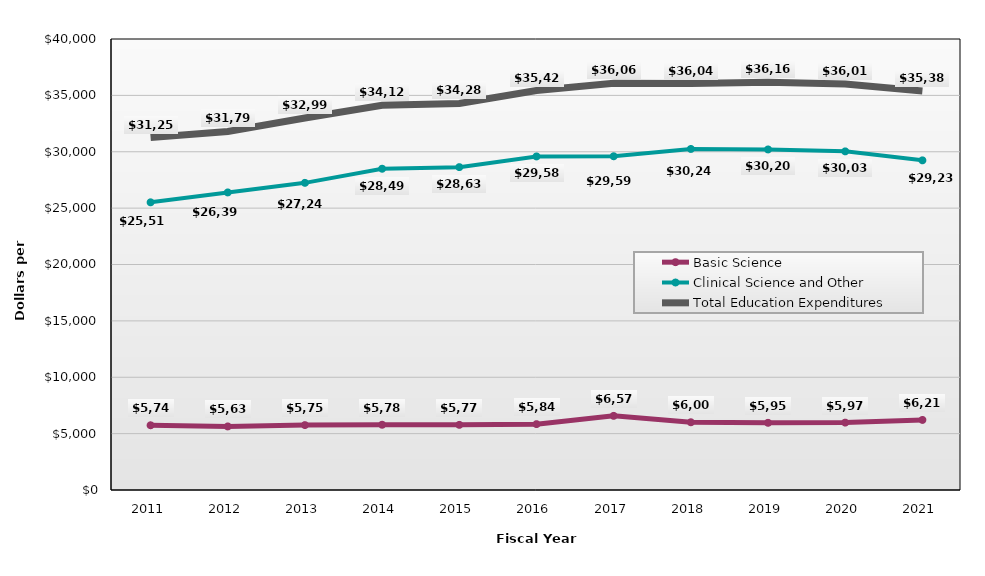
| Category | Basic Science | Clinical Science and Other | Total Education Expenditures |
|---|---|---|---|
| 2011.0 | 5741 | 25514 | 31255 |
| 2012.0 | 5637 | 26392 | 31799 |
| 2013.0 | 5756 | 27241 | 32997 |
| 2014.0 | 5787 | 28493 | 34121 |
| 2015.0 | 5778 | 28636 | 34288 |
| 2016.0 | 5841 | 29586 | 35426 |
| 2017.0 | 6575 | 29598 | 36066 |
| 2018.0 | 6007 | 30247 | 36044 |
| 2019.0 | 5959 | 30204 | 36162 |
| 2020.0 | 5977 | 30034 | 36011 |
| 2021.0 | 6215 | 29238 | 35385 |